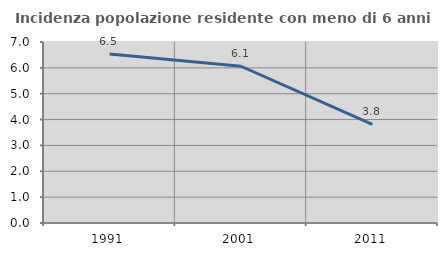
| Category | Incidenza popolazione residente con meno di 6 anni |
|---|---|
| 1991.0 | 6.533 |
| 2001.0 | 6.062 |
| 2011.0 | 3.812 |